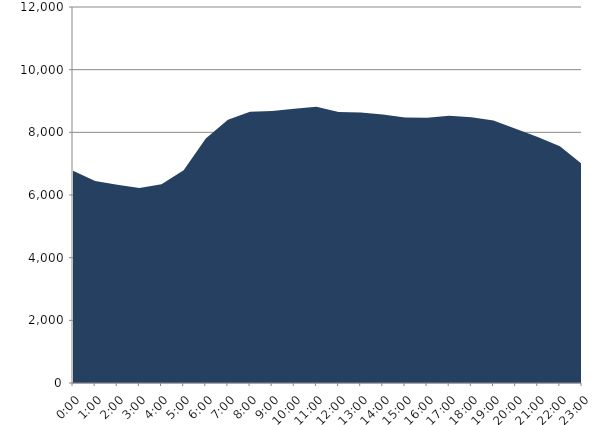
| Category | Series 0 | Series 1 |
|---|---|---|
| 2022-06-15 |  | 6776.53 |
| 2022-06-15 01:00:00 |  | 6443.032 |
| 2022-06-15 02:00:00 |  | 6326.52 |
| 2022-06-15 03:00:00 |  | 6224.171 |
| 2022-06-15 04:00:00 |  | 6340.811 |
| 2022-06-15 05:00:00 |  | 6791.579 |
| 2022-06-15 06:00:00 |  | 7804.347 |
| 2022-06-15 07:00:00 |  | 8397.707 |
| 2022-06-15 08:00:00 |  | 8655.858 |
| 2022-06-15 09:00:00 |  | 8677.262 |
| 2022-06-15 10:00:00 |  | 8751.716 |
| 2022-06-15 11:00:00 |  | 8819.667 |
| 2022-06-15 12:00:00 |  | 8645.118 |
| 2022-06-15 13:00:00 |  | 8634.943 |
| 2022-06-15 14:00:00 |  | 8568.308 |
| 2022-06-15 15:00:00 |  | 8475.005 |
| 2022-06-15 16:00:00 |  | 8468.625 |
| 2022-06-15 17:00:00 |  | 8530.129 |
| 2022-06-15 18:00:00 |  | 8481.186 |
| 2022-06-15 19:00:00 |  | 8375.18 |
| 2022-06-15 20:00:00 |  | 8117.594 |
| 2022-06-15 21:00:00 |  | 7853.609 |
| 2022-06-15 22:00:00 |  | 7559.682 |
| 2022-06-15 23:00:00 |  | 6988.188 |